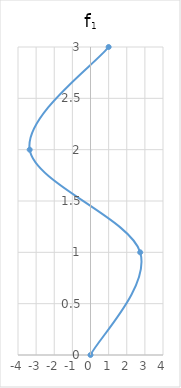
| Category | f1 |
|---|---|
| 0.0 | 0 |
| 2.74273031006833 | 1 |
| -3.356520537489663 | 2 |
| 1.0 | 3 |